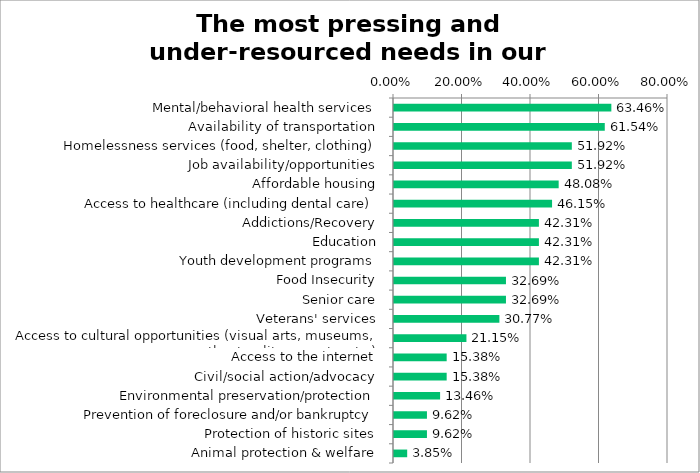
| Category | Responses |
|---|---|
| Mental/behavioral health services | 0.635 |
| Availability of transportation | 0.615 |
| Homelessness services (food, shelter, clothing) | 0.519 |
| Job availability/opportunities | 0.519 |
| Affordable housing | 0.481 |
| Access to healthcare (including dental care) | 0.462 |
| Addictions/Recovery | 0.423 |
| Education | 0.423 |
| Youth development programs | 0.423 |
| Food Insecurity | 0.327 |
| Senior care | 0.327 |
| Veterans' services | 0.308 |
| Access to cultural opportunities (visual arts, museums, theater, literary arts, etc.) | 0.212 |
| Access to the internet | 0.154 |
| Civil/social action/advocacy | 0.154 |
| Environmental preservation/protection | 0.135 |
| Prevention of foreclosure and/or bankruptcy | 0.096 |
| Protection of historic sites | 0.096 |
| Animal protection & welfare | 0.038 |